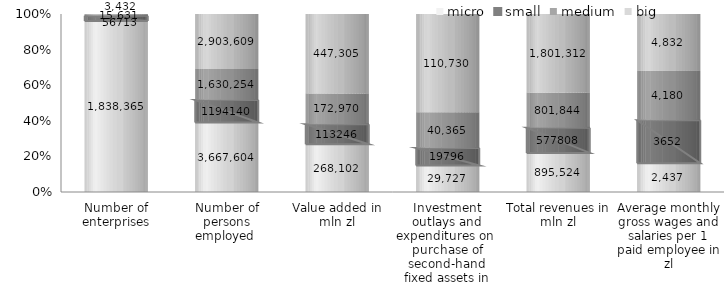
| Category | micro | small | medium | big  |
|---|---|---|---|---|
| Number of enterprises | 1838365 | 56713 | 15631 | 3432 |
| Number of persons employed  | 3667604 | 1194140 | 1630254 | 2903609 |
| Value added in mln zl | 268102 | 113246 | 172970 | 447305 |
| Investment outlays and expenditures on  purchase of second-hand fixed assets in mln zl | 29727 | 19796 | 40365 | 110730 |
| Total revenues in mln zl | 895524 | 577808 | 801844 | 1801312 |
| Average monthly gross wages and salaries per 1 paid employee in zl | 2437 | 3652 | 4180 | 4832 |